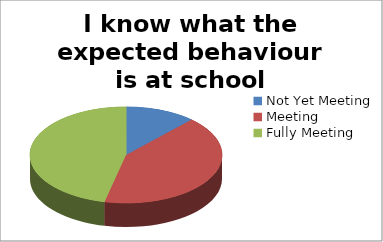
| Category | I know what the expected behaviour is at school |
|---|---|
| Not Yet Meeting | 10 |
| Meeting | 35 |
| Fully Meeting | 39 |